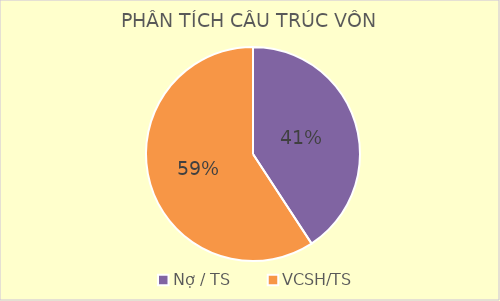
| Category | Series 0 |
|---|---|
| Nợ / TS | 0.408 |
| VCSH/TS | 0.592 |